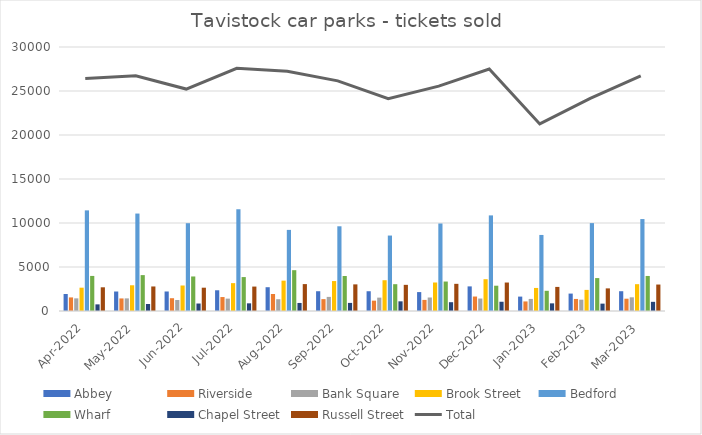
| Category | Abbey | Riverside | Bank Square | Brook Street | Bedford | Wharf | Chapel Street | Russell Street |
|---|---|---|---|---|---|---|---|---|
| Apr-2022 | 1934 | 1544 | 1437 | 2650 | 11435 | 3985 | 754 | 2693 |
| May-2022 | 2215 | 1428 | 1434 | 2924 | 11074 | 4078 | 794 | 2788 |
| Jun-2022 | 2218 | 1453 | 1253 | 2898 | 9977 | 3924 | 850 | 2648 |
| Jul-2022 | 2356 | 1585 | 1408 | 3167 | 11563 | 3855 | 871 | 2776 |
| Aug-2022 | 2703 | 1931 | 1338 | 3450 | 9217 | 4639 | 914 | 3057 |
| Sep-2022 | 2247 | 1349 | 1603 | 3403 | 9627 | 3976 | 919 | 3026 |
| Oct-2022 | 2246 | 1176 | 1520 | 3497 | 8574 | 3047 | 1099 | 2972 |
| Nov-2022 | 2149 | 1260 | 1534 | 3238 | 9942 | 3348 | 1001 | 3087 |
| Dec-2022 | 2797 | 1644 | 1418 | 3613 | 10864 | 2874 | 1051 | 3235 |
| Jan-2023 | 1636 | 1087 | 1373 | 2620 | 8643 | 2295 | 869 | 2737 |
| Feb-2023 | 1979 | 1370 | 1287 | 2398 | 9987 | 3741 | 837 | 2570 |
| Mar-2023 | 2248 | 1397 | 1555 | 3048 | 10447 | 3981 | 1042 | 3007 |